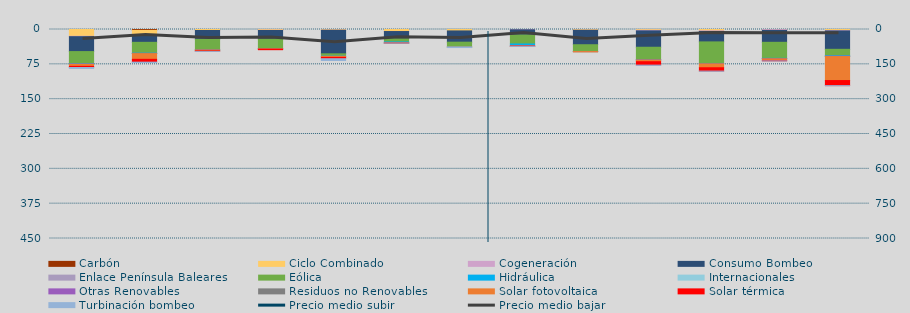
| Category | Carbón | Ciclo Combinado | Cogeneración | Consumo Bombeo | Enlace Península Baleares | Eólica | Hidráulica | Internacionales | Otras Renovables | Residuos no Renovables | Solar fotovoltaica | Solar térmica | Turbinación bombeo |
|---|---|---|---|---|---|---|---|---|---|---|---|---|---|
| 0 | 0 | 14634.199 | 838.098 | 32075.867 | 0 | 26340.743 | 533.073 | 0 | 507.085 | 0 | 4421.722 | 2509.099 | 1924.625 |
| 1 | 1932.082 | 9683.392 | 448.406 | 15579.715 | 0 | 23351.965 | 345.088 | 0 | 633.184 | 108.783 | 12157.29 | 6064.342 | 913.05 |
| 2 | 0 | 2088.417 | 56.138 | 18984.933 | 0 | 23010.334 | 40.779 | 0 | 39.002 | 82.474 | 1741.959 | 1100.186 | 17.7 |
| 3 | 20 | 1489.042 | 599.786 | 18456.273 | 0 | 20881.86 | 87.748 | 0 | 304.724 | 12.55 | 573.462 | 1034.589 | 0 |
| 4 | 0 | 1431.5 | 183.958 | 50768.847 | 0 | 5100.208 | 273.474 | 0 | 90.045 | 0 | 2259.405 | 2752.042 | 3910.508 |
| 5 | 0 | 4345.9 | 27.314 | 15616.296 | 0 | 6806.453 | 2149.971 | 0 | 152.334 | 42.654 | 44.067 | 19 | 204.333 |
| 6 | 0 | 3059.067 | 0 | 24243.492 | 0 | 10425.232 | 13.796 | 0 | 0 | 0 | 9.194 | 0 | 1113.3 |
| 7 | 0 | 0 | 655.675 | 11045.084 | 0 | 19430.531 | 3297.137 | 0 | 1221.2 | 4.575 | 380.934 | 279.19 | 100 |
| 8 | 0 | 1578.425 | 97.391 | 31105.358 | 0 | 14760.555 | 0.525 | 0 | 6.9 | 0 | 610.128 | 0 | 0 |
| 9 | 0 | 1682.35 | 1288.318 | 35237.998 | 0 | 26715.501 | 538.936 | 0 | 327.466 | 97.457 | 3459.795 | 7401.339 | 450.583 |
| 10 | 0 | 2896.525 | 1320.794 | 22481.384 | 0 | 46423.207 | 245.293 | 0 | 655.227 | 248.362 | 8080.179 | 7222.305 | 292.5 |
| 11 | 0 | 199.85 | 1687.618 | 25714.166 | 0 | 34475.114 | 354.461 | 0 | 851.955 | 108.267 | 3215.484 | 949.057 | 183.208 |
| 12 | 0 | 2261.625 | 837.542 | 39583.668 | 0 | 13865.681 | 874.017 | 0 | 764.251 | 122.4 | 51586.092 | 10959.39 | 140 |